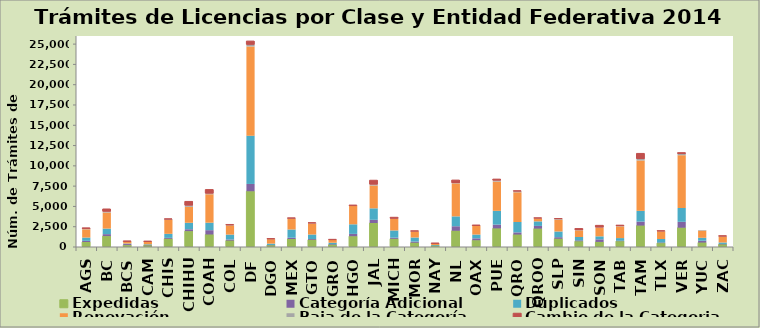
| Category | Expedidas | Categoría Adicional | Duplicados | Renovación | Baja de la Categoría | Cambio de la Categoria |
|---|---|---|---|---|---|---|
| AGS | 618 | 142 | 404 | 1022 | 55 | 109 |
| BC | 1345 | 240 | 682 | 1984 | 107 | 323 |
| BCS | 234 | 129 | 64 | 252 | 7 | 1 |
| CAM | 202 | 44 | 83 | 327 | 7 | 15 |
| CHIS | 1012 | 114 | 498 | 1710 | 65 | 58 |
| CHIHU | 1958 | 230 | 797 | 1967 | 155 | 506 |
| COAH | 1541 | 532 | 922 | 3506 | 82 | 491 |
| COL | 790 | 134 | 604 | 1141 | 45 | 6 |
| DF | 6869 | 900 | 5952 | 10993 | 207 | 450 |
| DGO | 212 | 39 | 168 | 545 | 11 | 29 |
| MEX | 984 | 157 | 1016 | 1321 | 50 | 15 |
| GTO | 891 | 98 | 550 | 1345 | 38 | 60 |
| GRO | 274 | 72 | 179 | 349 | 7 | 22 |
| HGO | 1326 | 290 | 1181 | 2306 | 0 | 1 |
| JAL | 2957 | 396 | 1412 | 2811 | 119 | 528 |
| MICH | 1007 | 142 | 889 | 1444 | 6 | 171 |
| MOR | 524 | 148 | 499 | 739 | 25 | 15 |
| NAY | 147 | 19 | 77 | 178 | 4 | 16 |
| NL | 1996 | 563 | 1215 | 4066 | 38 | 363 |
| OAX | 834 | 236 | 463 | 1079 | 31 | 8 |
| PUE | 2292 | 469 | 1695 | 3607 | 129 | 168 |
| QRO | 1529 | 273 | 1280 | 3661 | 124 | 34 |
| QROO | 2262 | 338 | 556 | 357 | 19 | 35 |
| SLP | 1017 | 192 | 704 | 1467 | 69 | 36 |
| SIN | 708 | 111 | 416 | 815 | 30 | 192 |
| SON | 625 | 320 | 370 | 1066 | 31 | 252 |
| TAB | 718 | 65 | 316 | 1441 | 37 | 109 |
| TAM | 2637 | 494 | 1322 | 6207 | 180 | 689 |
| TLX | 479 | 76 | 430 | 944 | 17 | 34 |
| VER | 2374 | 729 | 1704 | 6502 | 165 | 147 |
| YUC | 545 | 230 | 360 | 876 | 72 | 0 |
| ZAC | 321 | 56 | 180 | 720 | 21 | 79 |